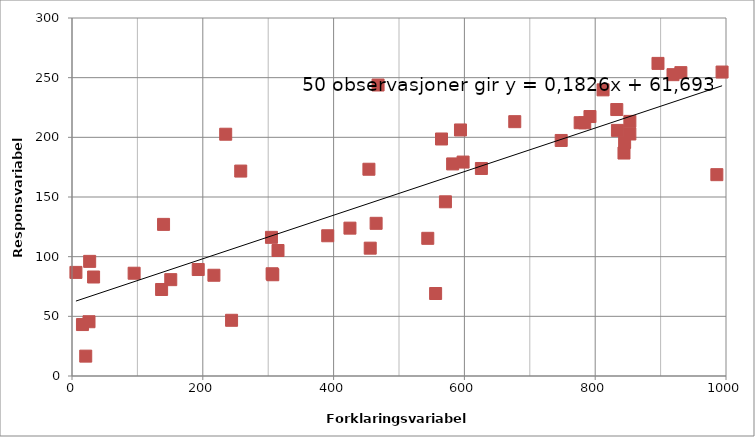
| Category | Series 1 |
|---|---|
| 454.0 | 173.261 |
| 193.0 | 89.232 |
| 33.0 | 82.96 |
| 677.0 | 213.135 |
| 140.0 | 127.05 |
| 556.0 | 69.122 |
| 833.0 | 223.287 |
| 305.0 | 116.182 |
| 27.0 | 96.057 |
| 582.0 | 177.722 |
| 986.0 | 168.719 |
| 217.0 | 84.426 |
| 571.0 | 145.98 |
| 306.0 | 85.683 |
| 844.0 | 186.844 |
| 235.0 | 202.604 |
| 151.0 | 80.744 |
| 26.0 | 45.486 |
| 931.0 | 254.224 |
| 21.0 | 16.649 |
| 626.0 | 173.902 |
| 391.0 | 117.52 |
| 244.0 | 46.689 |
| 792.0 | 217.43 |
| 468.0 | 243.846 |
| 16.0 | 43.106 |
| 784.0 | 212.163 |
| 994.0 | 254.714 |
| 598.0 | 179.275 |
| 544.0 | 115.368 |
| 6.0 | 86.812 |
| 425.0 | 123.902 |
| 258.0 | 171.726 |
| 845.0 | 195.754 |
| 853.0 | 202.801 |
| 307.0 | 84.859 |
| 315.0 | 105.16 |
| 853.0 | 213.348 |
| 137.0 | 72.496 |
| 777.0 | 212.258 |
| 834.0 | 205.82 |
| 95.0 | 86.12 |
| 456.0 | 107.126 |
| 812.0 | 239.788 |
| 465.0 | 127.944 |
| 594.0 | 206.172 |
| 565.0 | 198.606 |
| 919.0 | 252.514 |
| 748.0 | 197.384 |
| 896.0 | 261.961 |